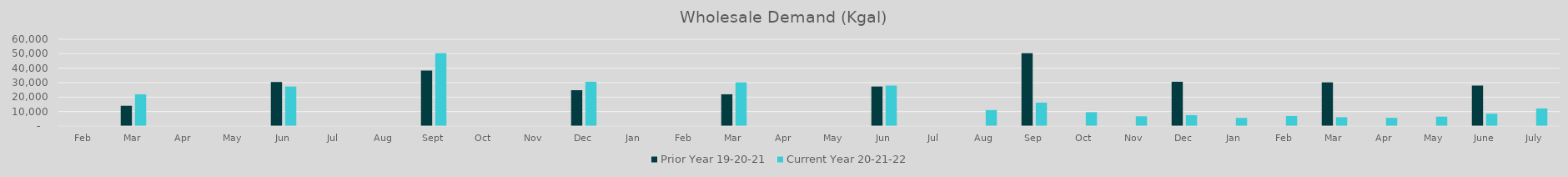
| Category | Prior Year 19-20-21 | Current Year 20-21-22 |
|---|---|---|
| Feb | 0 | 0 |
| Mar | 14013.78 | 21965.02 |
| Apr | 0 | 0 |
| May | 0 | 0 |
| Jun | 30443.6 | 27331 |
| Jul | 0 | 0 |
| Aug | 0 | 0 |
| Sep | 38376.14 | 50400.24 |
| Oct | 0 | 0 |
| Nov | 0 | 0 |
| Dec | 24784.98 | 30611.9 |
| Jan | 0 | 0 |
| Feb | 0 | 0 |
| Mar | 21965.02 | 30196.76 |
| Apr | 0 | 0 |
| May | 0 | 0 |
| Jun | 27331 | 27993.9 |
| Jul | 0 | 0 |
| Aug | 0 | 11056.179 |
| Sep | 50400.24 | 16202.763 |
| Oct | 0 | 9585.62 |
| Nov | 0 | 6754.44 |
| Dec | 30611.9 | 7547.32 |
| Jan | 0 | 5643.66 |
| Feb | 0 | 6907.78 |
| Mar | 30196.76 | 6111.16 |
| Apr | 0 | 5707.24 |
| May | 0 | 6522.56 |
| June | 27993.9 | 8549.64 |
| July | 0 | 12192.4 |